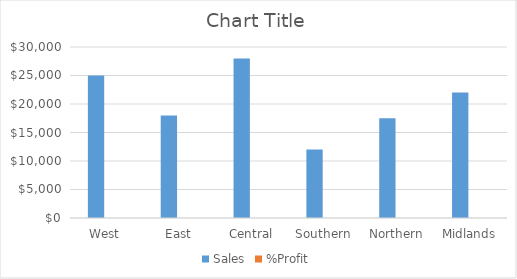
| Category | Sales | %Profit |
|---|---|---|
| West | 25000 | 0.016 |
| East | 18000 | 0.025 |
| Central | 28000 | 0.024 |
| Southern | 12000 | 0.035 |
| Northern | 17500 | 0.04 |
| Midlands | 22000 | 0.019 |